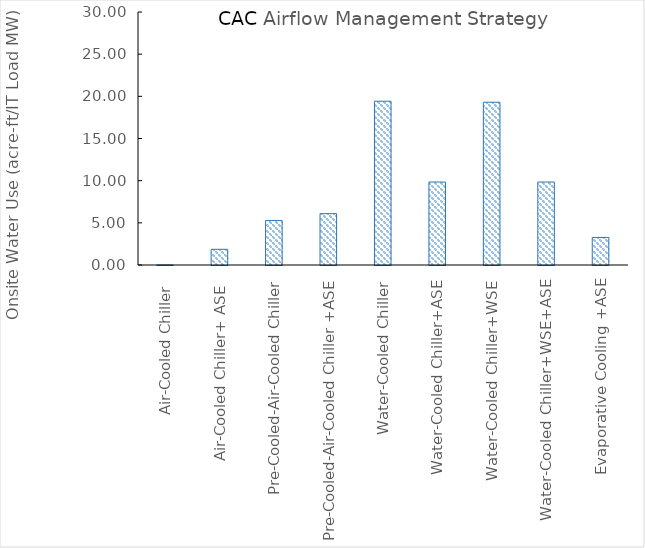
| Category | Series 0 |
|---|---|
| Air-Cooled Chiller  | 0.004 |
| Air-Cooled Chiller+ ASE  | 1.858 |
| Pre-Cooled-Air-Cooled Chiller | 5.268 |
| Pre-Cooled-Air-Cooled Chiller +ASE | 6.089 |
| Water-Cooled Chiller | 19.42 |
| Water-Cooled Chiller+ASE | 9.84 |
| Water-Cooled Chiller+WSE | 19.3 |
| Water-Cooled Chiller+WSE+ASE | 9.84 |
| Evaporative Cooling +ASE | 3.269 |